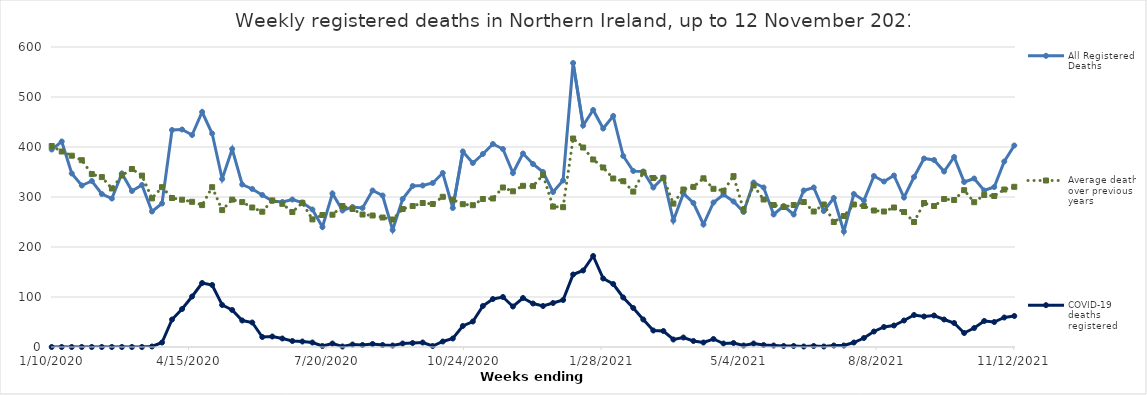
| Category | All Registered Deaths | Average deaths over previous 5 years | COVID-19 deaths registered |
|---|---|---|---|
| 1/10/20 | 395 | 402 | 0 |
| 1/17/20 | 411 | 391 | 0 |
| 1/24/20 | 347 | 382.6 | 0 |
| 1/31/20 | 323 | 373.6 | 0 |
| 2/7/20 | 332 | 345.8 | 0 |
| 2/14/20 | 306 | 339.8 | 0 |
| 2/21/20 | 297 | 317 | 0 |
| 2/28/20 | 347 | 343 | 0 |
| 3/6/20 | 312 | 356 | 0 |
| 3/13/20 | 324 | 342.8 | 0 |
| 3/20/20 | 271 | 297.2 | 1 |
| 3/27/20 | 287 | 319.6 | 9 |
| 4/3/20 | 434 | 298 | 55 |
| 4/10/20 | 435 | 294.6 | 76 |
| 4/17/20 | 424 | 290.4 | 101 |
| 4/24/20 | 470 | 283.8 | 128 |
| 5/1/20 | 427 | 319.6 | 124 |
| 5/8/20 | 336 | 273.8 | 84 |
| 5/15/20 | 396 | 294.8 | 74 |
| 5/22/20 | 325 | 289.8 | 53 |
| 5/29/20 | 316 | 279 | 49 |
| 6/5/20 | 304 | 270.6 | 20 |
| 6/12/20 | 292 | 293.2 | 21 |
| 6/19/20 | 290 | 286.4 | 17 |
| 6/26/20 | 295 | 270 | 12 |
| 7/3/20 | 289 | 288.2 | 11 |
| 7/10/20 | 275 | 255.2 | 9 |
| 7/17/20 | 240 | 264 | 2 |
| 7/24/20 | 307 | 264.6 | 7 |
| 7/31/20 | 273 | 282 | 1 |
| 8/7/20 | 280 | 276 | 5 |
| 8/14/20 | 278 | 265 | 4 |
| 8/21/20 | 313 | 263 | 6 |
| 8/28/20 | 303 | 259 | 4 |
| 9/4/20 | 234 | 255 | 3 |
| 9/11/20 | 296 | 276 | 7 |
| 9/18/20 | 322 | 282 | 8 |
| 9/25/20 | 323 | 288 | 9 |
| 10/2/20 | 328 | 286 | 2 |
| 10/9/20 | 348 | 300.4 | 11 |
| 10/16/20 | 278 | 294.8 | 17 |
| 10/23/20 | 391 | 285.6 | 42 |
| 10/30/20 | 368 | 283.6 | 51 |
| 11/6/20 | 386 | 296 | 82 |
| 11/13/20 | 406 | 297 | 96 |
| 11/20/20 | 396 | 319 | 100 |
| 11/27/20 | 348 | 311.4 | 81 |
| 12/4/20 | 387 | 322.4 | 98 |
| 12/11/20 | 366 | 321.8 | 87 |
| 12/18/20 | 350 | 343.8 | 82 |
| 12/25/20 | 310 | 280.8 | 88 |
| 1/1/21 | 333 | 279.6 | 94 |
| 1/8/21 | 568 | 417 | 145 |
| 1/15/21 | 443 | 399 | 153 |
| 1/22/21 | 474 | 375 | 182 |
| 1/29/21 | 437 | 359 | 137 |
| 2/5/21 | 462 | 337 | 126 |
| 2/12/21 | 382 | 331.6 | 99 |
| 2/19/21 | 352 | 310.8 | 78 |
| 2/26/21 | 351 | 349 | 55 |
| 3/5/21 | 319 | 338 | 33 |
| 3/12/21 | 339 | 338 | 32 |
| 3/19/21 | 253 | 286.8 | 15 |
| 3/26/21 | 307 | 315 | 19 |
| 4/2/21 | 288 | 320.2 | 12 |
| 4/9/21 | 245 | 337.4 | 9 |
| 4/16/21 | 289 | 316.4 | 16 |
| 4/23/21 | 305 | 312.4 | 7 |
| 4/30/21 | 291 | 341.8 | 8 |
| 5/7/21 | 270 | 274 | 3 |
| 5/14/21 | 329 | 323 | 7 |
| 5/21/21 | 319 | 295 | 4 |
| 5/28/21 | 265 | 284 | 3 |
| 6/4/21 | 282 | 280 | 2 |
| 6/11/21 | 265 | 284 | 2 |
| 6/18/21 | 313 | 290 | 1 |
| 6/25/21 | 319 | 271 | 2 |
| 7/2/21 | 272 | 285 | 1 |
| 7/9/21 | 298 | 250 | 3 |
| 7/16/21 | 231 | 262 | 3 |
| 7/23/21 | 306 | 285 | 9 |
| 7/30/21 | 293 | 282 | 18 |
| 8/6/21 | 342 | 273 | 31 |
| 8/13/21 | 331 | 271 | 40 |
| 8/20/21 | 343 | 279 | 43 |
| 8/27/21 | 299 | 270 | 53 |
| 9/3/21 | 340 | 250 | 64 |
| 9/10/21 | 377 | 288 | 61 |
| 9/17/21 | 374 | 282 | 63 |
| 9/24/21 | 351 | 296 | 55 |
| 10/1/21 | 380 | 294 | 48 |
| 10/8/21 | 330 | 313.6 | 28 |
| 10/15/21 | 337 | 289.6 | 38 |
| 10/22/21 | 313 | 304 | 52 |
| 10/29/21 | 320 | 302 | 50 |
| 11/5/21 | 371 | 315 | 59 |
| 11/12/21 | 403 | 320.4 | 62 |